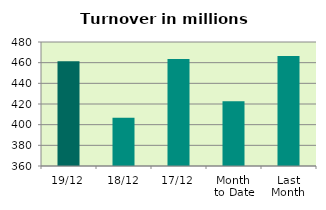
| Category | Series 0 |
|---|---|
| 19/12 | 461.481 |
| 18/12 | 406.723 |
| 17/12 | 463.621 |
| Month 
to Date | 422.658 |
| Last
Month | 466.544 |